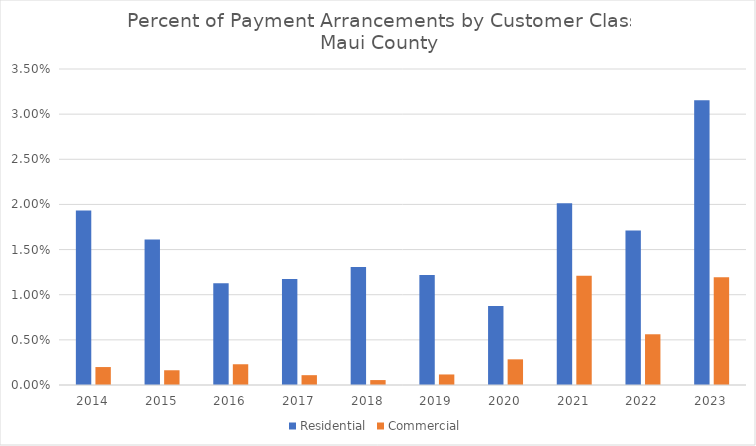
| Category | Residential | Commercial |
|---|---|---|
| 2014.0 | 0.019 | 0.002 |
| 2015.0 | 0.016 | 0.002 |
| 2016.0 | 0.011 | 0.002 |
| 2017.0 | 0.012 | 0.001 |
| 2018.0 | 0.013 | 0.001 |
| 2019.0 | 0.012 | 0.001 |
| 2020.0 | 0.009 | 0.003 |
| 2021.0 | 0.02 | 0.012 |
| 2022.0 | 0.017 | 0.006 |
| 2023.0 | 0.032 | 0.012 |